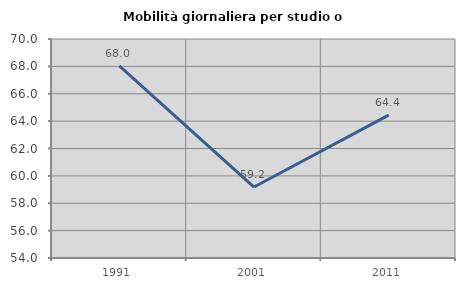
| Category | Mobilità giornaliera per studio o lavoro |
|---|---|
| 1991.0 | 68.029 |
| 2001.0 | 59.186 |
| 2011.0 | 64.44 |